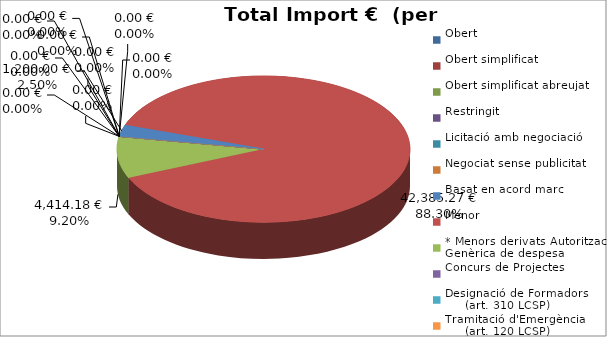
| Category | Total preu
(amb IVA) |
|---|---|
| Obert | 0 |
| Obert simplificat | 0 |
| Obert simplificat abreujat | 0 |
| Restringit | 0 |
| Licitació amb negociació | 0 |
| Negociat sense publicitat | 0 |
| Basat en acord marc | 1200 |
| Menor | 42385.27 |
| * Menors derivats Autorització Genèrica de despesa | 4414.18 |
| Concurs de Projectes | 0 |
| Designació de Formadors
     (art. 310 LCSP) | 0 |
| Tramitació d'Emergència
     (art. 120 LCSP) | 0 |